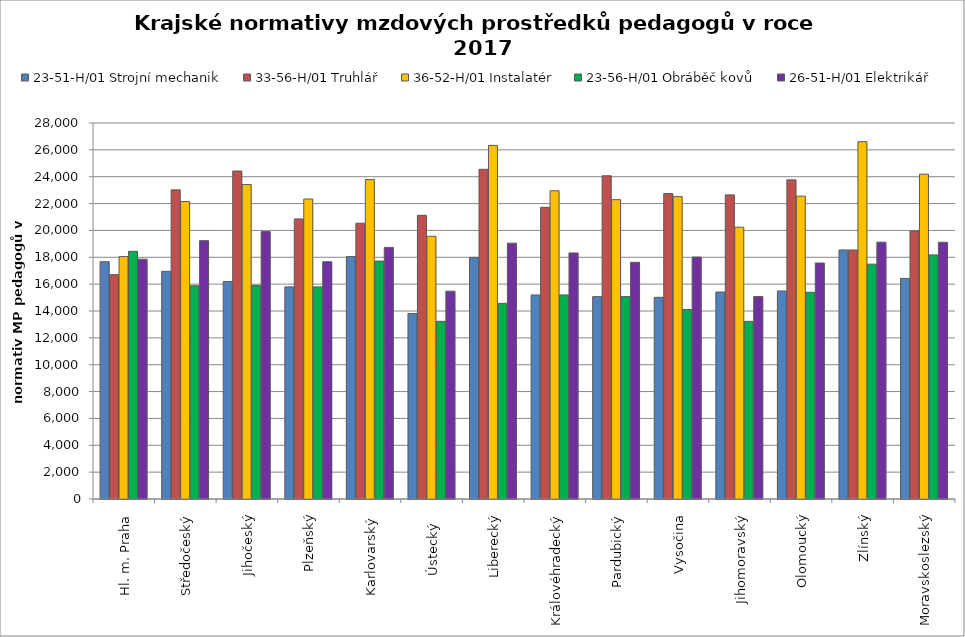
| Category | 23-51-H/01 Strojní mechanik | 33-56-H/01 Truhlář | 36-52-H/01 Instalatér | 23-56-H/01 Obráběč kovů | 26-51-H/01 Elektrikář |
|---|---|---|---|---|---|
| Hl. m. Praha | 17671.579 | 16704.478 | 18051.613 | 18448.352 | 17859.574 |
| Středočeský | 16953.367 | 23022.5 | 22150.382 | 15876.431 | 19237.668 |
| Jihočeský | 16197.136 | 24425.944 | 23416.042 | 15904.185 | 19913.404 |
| Plzeňský | 15794.83 | 20854.85 | 22339.705 | 15794.83 | 17670.015 |
| Karlovarský  | 18053.691 | 20534.351 | 23787.767 | 17716.795 | 18734.765 |
| Ústecký   | 13814.828 | 21123.077 | 19565.25 | 13230.938 | 15474.246 |
| Liberecký | 17990.792 | 24552.659 | 26329.534 | 14566.761 | 19049.132 |
| Královéhradecký | 15197.368 | 21719.275 | 22952.449 | 15197.368 | 18322.946 |
| Pardubický | 15071.436 | 24069.484 | 22290.435 | 15071.436 | 17627.966 |
| Vysočina | 15017.02 | 22748.693 | 22518.077 | 14111.062 | 18018.038 |
| Jihomoravský | 15410.027 | 22647.195 | 20242.966 | 13226.759 | 15075.493 |
| Olomoucký | 15491.829 | 23765.395 | 22551.778 | 15396.117 | 17575.617 |
| Zlínský | 18546.182 | 18546.182 | 26609.739 | 17486.4 | 19125.75 |
| Moravskoslezský | 16425.944 | 19962.353 | 24188.168 | 18176.754 | 19118.873 |